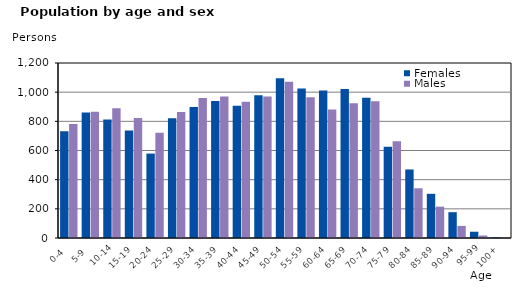
| Category | Females | Males |
|---|---|---|
|   0-4  | 732 | 782 |
|   5-9  | 861 | 865 |
| 10-14 | 813 | 889 |
| 15-19  | 738 | 823 |
| 20-24  | 579 | 721 |
| 25-29  | 821 | 864 |
| 30-34  | 898 | 960 |
| 35-39  | 940 | 971 |
| 40-44  | 907 | 934 |
| 45-49  | 979 | 970 |
| 50-54  | 1096 | 1072 |
| 55-59  | 1025 | 965 |
| 60-64  | 1011 | 882 |
| 65-69  | 1021 | 924 |
| 70-74  | 962 | 937 |
| 75-79  | 625 | 663 |
| 80-84  | 470 | 341 |
| 85-89  | 303 | 215 |
| 90-94  | 177 | 83 |
| 95-99 | 43 | 17 |
| 100+ | 4 | 1 |